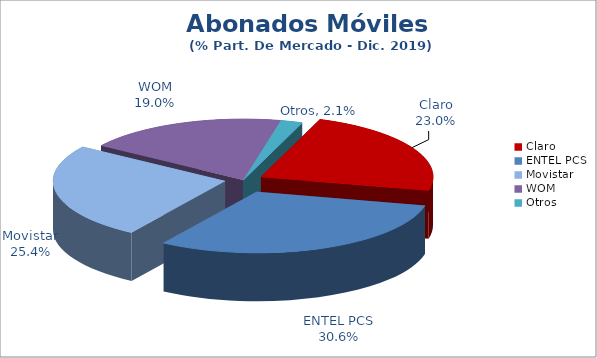
| Category | Series 0 |
|---|---|
| Claro | 0.23 |
| ENTEL PCS | 0.306 |
| Movistar | 0.254 |
| WOM | 0.19 |
| Otros | 0.021 |